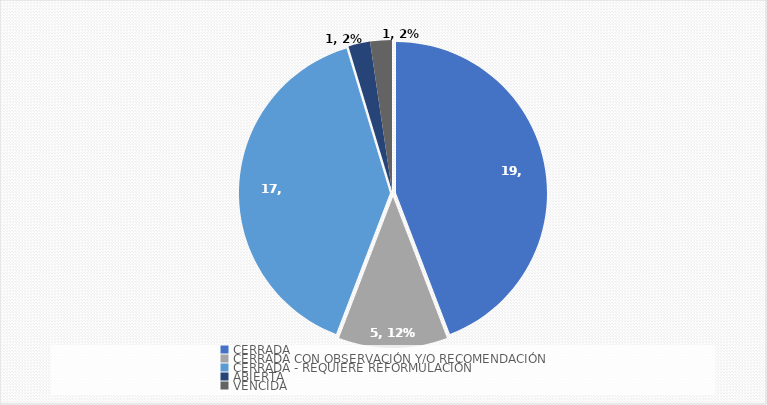
| Category | Series 0 |
|---|---|
| CERRADA | 19 |
| CERRADA CON OBSERVACIÓN Y/O RECOMENDACIÓN | 5 |
| CERRADA - REQUIERE REFORMULACIÓN | 17 |
| ABIERTA | 1 |
| VENCIDA | 1 |